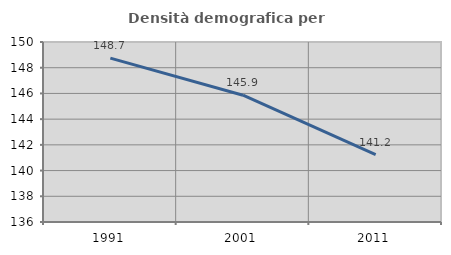
| Category | Densità demografica |
|---|---|
| 1991.0 | 148.744 |
| 2001.0 | 145.863 |
| 2011.0 | 141.247 |